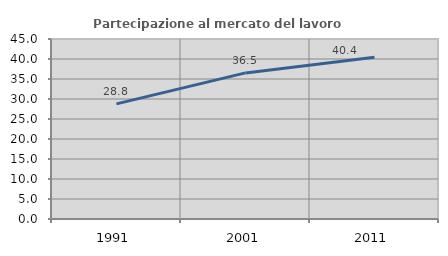
| Category | Partecipazione al mercato del lavoro  femminile |
|---|---|
| 1991.0 | 28.774 |
| 2001.0 | 36.528 |
| 2011.0 | 40.426 |